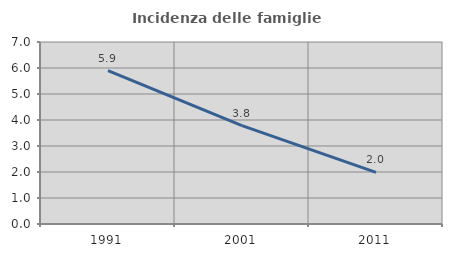
| Category | Incidenza delle famiglie numerose |
|---|---|
| 1991.0 | 5.897 |
| 2001.0 | 3.783 |
| 2011.0 | 1.986 |